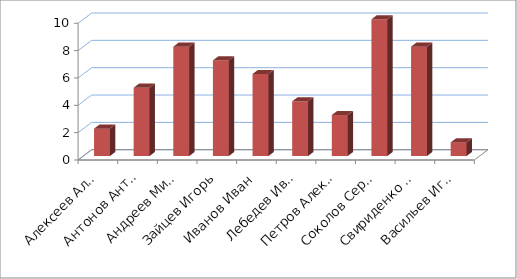
| Category | Series 0 |
|---|---|
| Алексеев Алексей | 2 |
| Антонов Антон | 5 |
| Андреев Михаил | 8 |
| Зайцев Игорь | 7 |
| Иванов Иван | 6 |
| Лебедев Иван | 4 |
| Петров Александр | 3 |
| Соколов Сергей | 10 |
| Свириденко Максим  | 8 |
| Васильев Игорь | 1 |